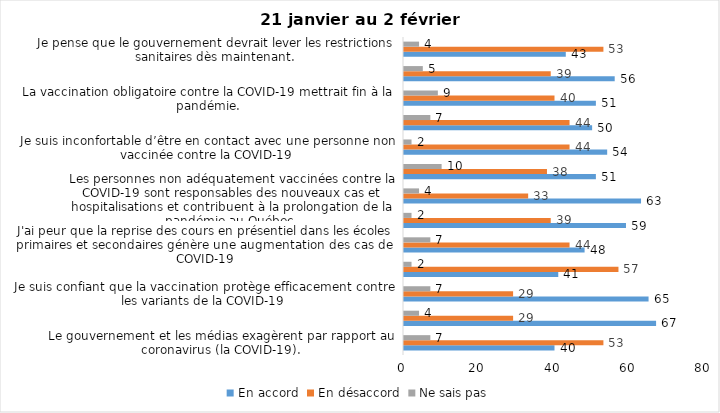
| Category | En accord | En désaccord | Ne sais pas |
|---|---|---|---|
| Le gouvernement et les médias exagèrent par rapport au coronavirus (la COVID-19). | 40 | 53 | 7 |
| J’ai peur que le système de santé soit débordé par les cas de COVID-19. | 67 | 29 | 4 |
| Je suis confiant que la vaccination protège efficacement contre les variants de la COVID-19 | 65 | 29 | 7 |
| Je suis favorable à ce que le port du masque ne soit plus obligatoire au Québec. | 41 | 57 | 2 |
| J'ai peur que la reprise des cours en présentiel dans les écoles primaires et secondaires génère une augmentation des cas de COVID-19 | 48 | 44 | 7 |
| Je crois que le passeport vaccinal devrait être requis pour davantage de services et commerces (ex. : spas, centre d’achats, centre de soins personnels. | 59 | 39 | 2 |
| Les personnes non adéquatement vaccinées contre la COVID-19 sont responsables des nouveaux cas et hospitalisations et contribuent à la prolongation de la pandémie au Québec. | 63 | 33 | 4 |
| La pandémie ne sera pas terminée au Québec avant que tous les habitants de la terre puissent être vaccinés contre la COVID-19.   | 51 | 38 | 10 |
| Je suis inconfortable d’être en contact avec une personne non vaccinée contre la COVID-19 | 54 | 44 | 2 |
| Je n'ai pas peur du variant Omicron, car il semble moins dangereux pour la santé. | 50 | 44 | 7 |
| La vaccination obligatoire contre la COVID-19 mettrait fin à la pandémie. | 51 | 40 | 9 |
| Je suis favorable à ce que les personnes non vaccinées paient une taxe supplémentaire (contribution santé). | 56 | 39 | 5 |
| Je pense que le gouvernement devrait lever les restrictions sanitaires dès maintenant. | 43 | 53 | 4 |